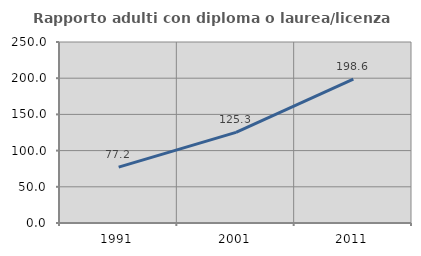
| Category | Rapporto adulti con diploma o laurea/licenza media  |
|---|---|
| 1991.0 | 77.208 |
| 2001.0 | 125.25 |
| 2011.0 | 198.616 |